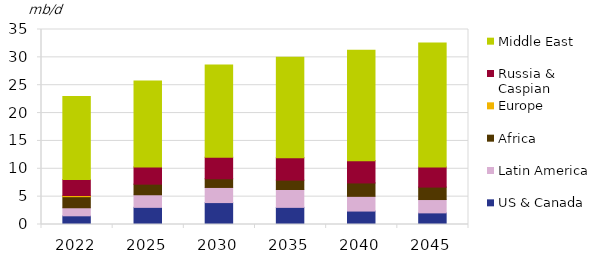
| Category | US & Canada | Latin America | Africa | Europe | Russia & Caspian | Middle East |
|---|---|---|---|---|---|---|
| 2022.0 | 1.56 | 1.444 | 1.986 | 0.21 | 2.88 | 14.898 |
| 2025.0 | 3.076 | 2.263 | 1.903 | -0.001 | 3.085 | 15.427 |
| 2030.0 | 3.933 | 2.717 | 1.557 | 0 | 3.862 | 16.571 |
| 2035.0 | 3.075 | 3.211 | 1.68 | 0 | 4.034 | 18.029 |
| 2040.0 | 2.412 | 2.64 | 2.41 | 0 | 3.998 | 19.815 |
| 2045.0 | 2.087 | 2.394 | 2.235 | 0 | 3.605 | 22.278 |